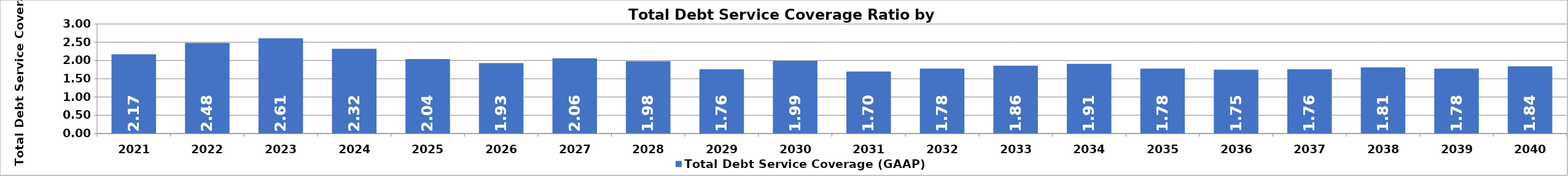
| Category | Total Debt Service Coverage (GAAP) |
|---|---|
| 2021.0 | 2.17 |
| 2022.0 | 2.48 |
| 2023.0 | 2.61 |
| 2024.0 | 2.32 |
| 2025.0 | 2.04 |
| 2026.0 | 1.93 |
| 2027.0 | 2.06 |
| 2028.0 | 1.98 |
| 2029.0 | 1.76 |
| 2030.0 | 1.99 |
| 2031.0 | 1.7 |
| 2032.0 | 1.78 |
| 2033.0 | 1.86 |
| 2034.0 | 1.91 |
| 2035.0 | 1.78 |
| 2036.0 | 1.75 |
| 2037.0 | 1.76 |
| 2038.0 | 1.81 |
| 2039.0 | 1.78 |
| 2040.0 | 1.84 |